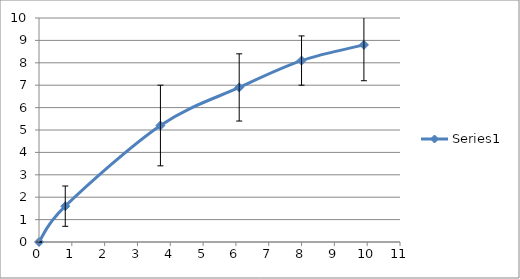
| Category | Series 0 |
|---|---|
| 0.0 | 0 |
| 0.8 | 1.6 |
| 3.7 | 5.2 |
| 6.1 | 6.9 |
| 8.0 | 8.1 |
| 9.9 | 8.8 |